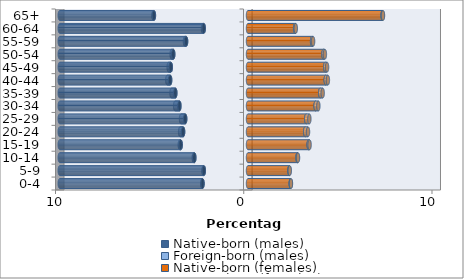
| Category | Native-born (males) | Foreign-born (males) | Native-born (females) | Foreign-born (females) |
|---|---|---|---|---|
| 0-4 | -2.416 | -0.014 | 2.27 | 0.011 |
| 5-9 | -2.347 | -0.02 | 2.198 | 0.018 |
| 10-14 | -2.851 | -0.03 | 2.628 | 0.03 |
| 15-19 | -3.575 | -0.048 | 3.222 | 0.05 |
| 20-24 | -3.447 | -0.159 | 3.037 | 0.151 |
| 25-29 | -3.336 | -0.221 | 3.092 | 0.168 |
| 30-34 | -3.644 | -0.227 | 3.592 | 0.145 |
| 35-39 | -3.861 | -0.202 | 3.836 | 0.131 |
| 40-44 | -4.136 | -0.152 | 4.13 | 0.114 |
| 45-49 | -4.101 | -0.113 | 4.103 | 0.097 |
| 50-54 | -3.972 | -0.085 | 4.009 | 0.076 |
| 55-59 | -3.289 | -0.061 | 3.404 | 0.054 |
| 60-64 | -2.352 | -0.04 | 2.503 | 0.035 |
| 65+ | -4.998 | -0.025 | 7.149 | 0.022 |